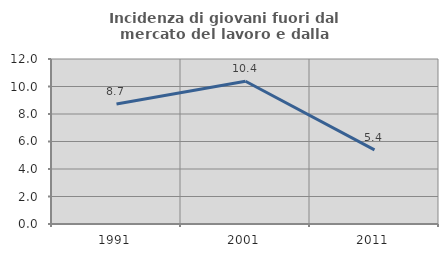
| Category | Incidenza di giovani fuori dal mercato del lavoro e dalla formazione  |
|---|---|
| 1991.0 | 8.721 |
| 2001.0 | 10.381 |
| 2011.0 | 5.392 |